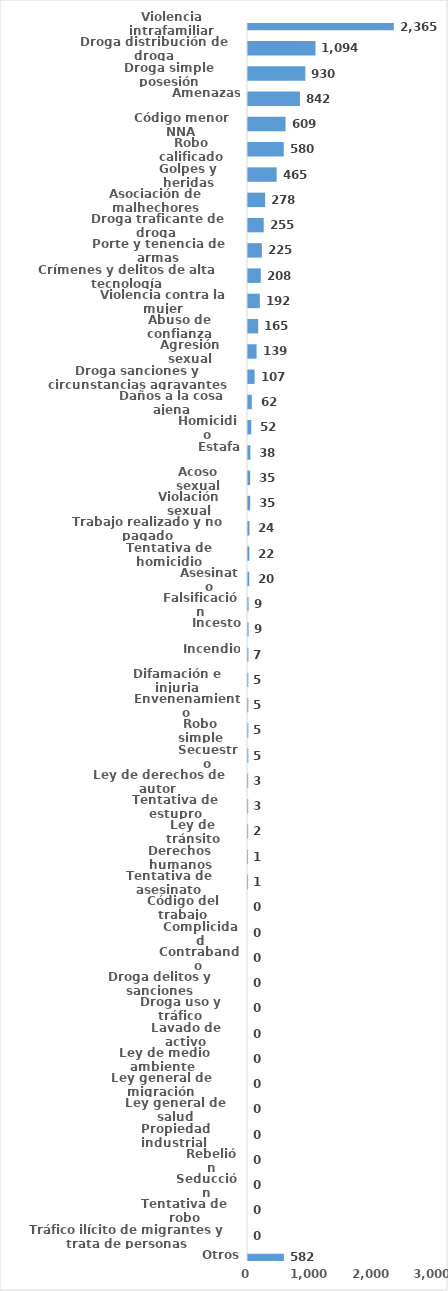
| Category | Series 0 |
|---|---|
| Violencia intrafamiliar | 2365 |
| Droga distribución de droga | 1094 |
| Droga simple posesión | 930 |
| Amenazas | 842 |
| Código menor NNA | 609 |
| Robo calificado | 580 |
| Golpes y heridas | 465 |
| Asociación de malhechores | 278 |
| Droga traficante de droga  | 255 |
| Porte y tenencia de armas | 225 |
| Crímenes y delitos de alta tecnología | 208 |
| Violencia contra la mujer | 192 |
| Abuso de confianza | 165 |
| Agresión sexual | 139 |
| Droga sanciones y circunstancias agravantes | 107 |
| Daños a la cosa ajena | 62 |
| Homicidio | 52 |
| Estafa | 38 |
| Acoso sexual | 35 |
| Violación sexual | 35 |
| Trabajo realizado y no pagado | 24 |
| Tentativa de homicidio | 22 |
| Asesinato | 20 |
| Falsificación | 9 |
| Incesto | 9 |
| Incendio | 7 |
| Difamación e injuria | 5 |
| Envenenamiento | 5 |
| Robo simple | 5 |
| Secuestro | 5 |
| Ley de derechos de autor  | 3 |
| Tentativa de estupro | 3 |
| Ley de tránsito | 2 |
| Derechos humanos | 1 |
| Tentativa de asesinato | 1 |
| Código del trabajo | 0 |
| Complicidad | 0 |
| Contrabando | 0 |
| Droga delitos y sanciones | 0 |
| Droga uso y tráfico | 0 |
| Lavado de activo | 0 |
| Ley de medio ambiente  | 0 |
| Ley general de migración | 0 |
| Ley general de salud | 0 |
| Propiedad industrial  | 0 |
| Rebelión | 0 |
| Seducción | 0 |
| Tentativa de robo | 0 |
| Tráfico ilícito de migrantes y trata de personas | 0 |
| Otros | 582 |